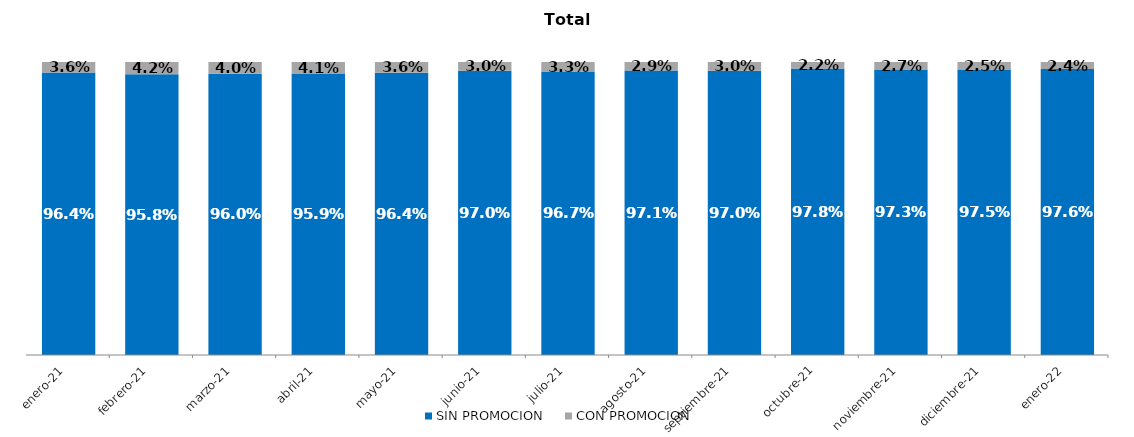
| Category | SIN PROMOCION   | CON PROMOCION   |
|---|---|---|
| 2021-01-01 | 0.964 | 0.036 |
| 2021-02-01 | 0.958 | 0.042 |
| 2021-03-01 | 0.96 | 0.04 |
| 2021-04-01 | 0.959 | 0.041 |
| 2021-05-01 | 0.964 | 0.036 |
| 2021-06-01 | 0.97 | 0.03 |
| 2021-07-01 | 0.967 | 0.033 |
| 2021-08-01 | 0.971 | 0.029 |
| 2021-09-01 | 0.97 | 0.03 |
| 2021-10-01 | 0.978 | 0.022 |
| 2021-11-01 | 0.973 | 0.027 |
| 2021-12-01 | 0.975 | 0.025 |
| 2022-01-01 | 0.976 | 0.024 |